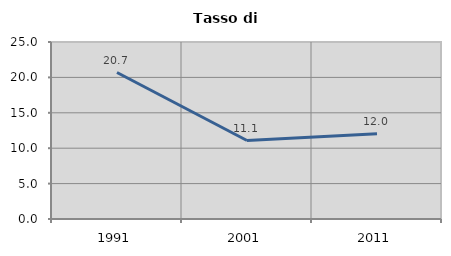
| Category | Tasso di disoccupazione   |
|---|---|
| 1991.0 | 20.69 |
| 2001.0 | 11.087 |
| 2011.0 | 12.031 |